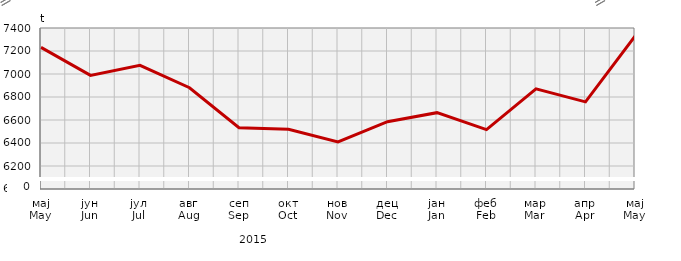
| Category | Прикупљање крављег млијека
Collecting of cow’s milk |
|---|---|
| мај
May | 7231.754 |
| јун
Jun | 6987.984 |
| јул
Jul | 7075.246 |
| авг
Aug | 6880.441 |
| сеп
Sep | 6532.974 |
| окт
Oct | 6519.778 |
| нов
Nov | 6409.6 |
| дец
Dec | 6585.351 |
| јан
Jan | 6663.893 |
| феб
Feb | 6516.44 |
| мар
Mar | 6870.8 |
| апр
Apr | 6757.289 |
| мај
May | 7329.328 |